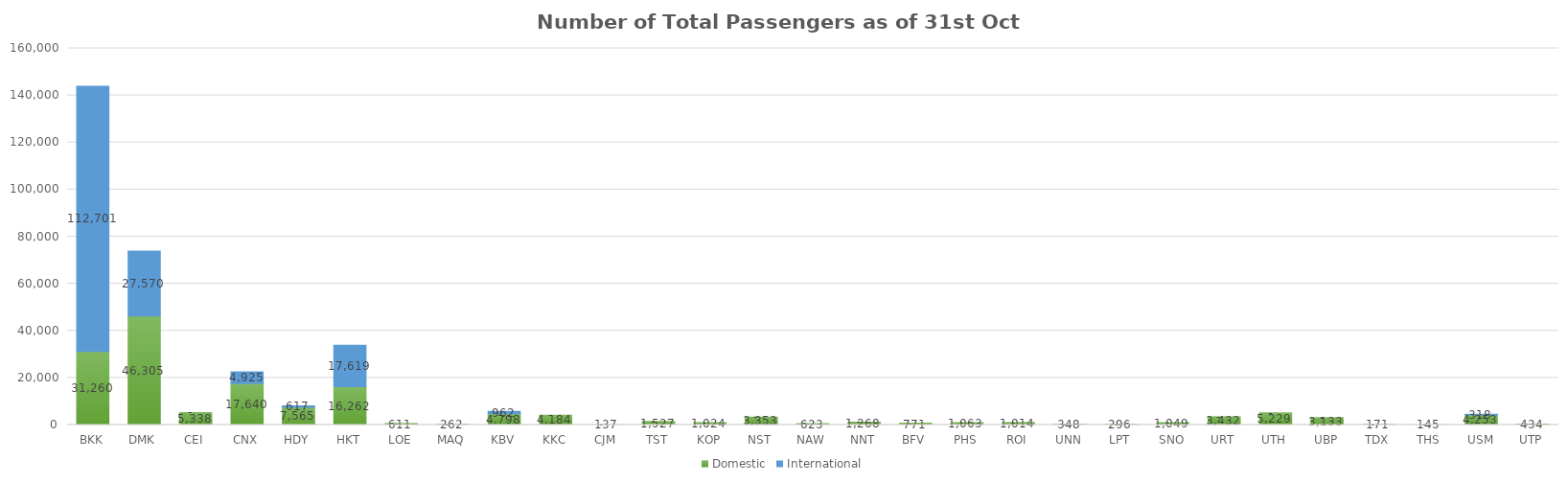
| Category | Domestic | International |
|---|---|---|
| BKK | 31260 | 112701 |
| DMK | 46305 | 27570 |
| CEI | 5338 | 0 |
| CNX | 17640 | 4925 |
| HDY | 7565 | 617 |
| HKT | 16262 | 17619 |
| LOE | 611 | 0 |
| MAQ | 262 | 0 |
| KBV | 4798 | 962 |
| KKC | 4184 | 0 |
| CJM | 137 | 0 |
| TST | 1527 | 0 |
| KOP | 1024 | 0 |
| NST | 3353 | 0 |
| NAW | 623 | 0 |
| NNT | 1268 | 0 |
| BFV | 771 | 0 |
| PHS | 1063 | 0 |
| ROI | 1014 | 0 |
| UNN | 348 | 0 |
| LPT | 296 | 0 |
| SNO | 1049 | 0 |
| URT | 3432 | 0 |
| UTH | 5229 | 0 |
| UBP | 3133 | 0 |
| TDX | 171 | 0 |
| THS | 145 | 0 |
| USM | 4253 | 318 |
| UTP | 434 | 0 |